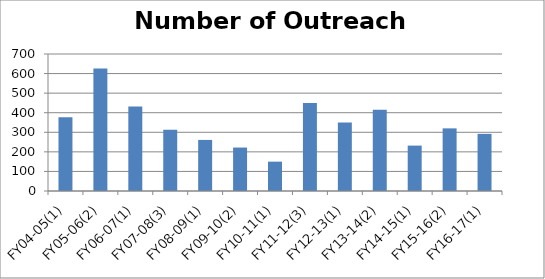
| Category | Number of Outreach Events |
|---|---|
| FY04-05(1) | 377 |
| FY05-06(2) | 626 |
| FY06-07(1) | 432 |
| FY07-08(3) | 313 |
| FY08-09(1) | 261 |
| FY09-10(2) | 222 |
| FY10-11(1) | 150 |
| FY11-12(3) | 450 |
| FY12-13(1) | 350 |
| FY13-14(2) | 415 |
| FY14-15(1) | 232 |
| FY15-16(2) | 320 |
| FY16-17(1) | 292 |